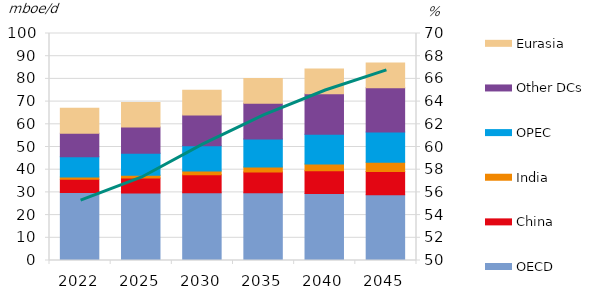
| Category | OECD | China  | India | OPEC | Other DCs | Eurasia |
|---|---|---|---|---|---|---|
| 2022.0 | 29.998 | 5.801 | 1.019 | 8.909 | 10.315 | 11.02 |
| 2025.0 | 29.731 | 6.595 | 1.21 | 9.701 | 11.529 | 10.883 |
| 2030.0 | 29.814 | 8.002 | 1.651 | 11.049 | 13.592 | 10.865 |
| 2035.0 | 29.829 | 9.168 | 2.247 | 12.242 | 15.822 | 10.912 |
| 2040.0 | 29.554 | 9.934 | 3.041 | 13.034 | 17.897 | 10.928 |
| 2045.0 | 28.942 | 10.247 | 4.085 | 13.368 | 19.495 | 10.892 |